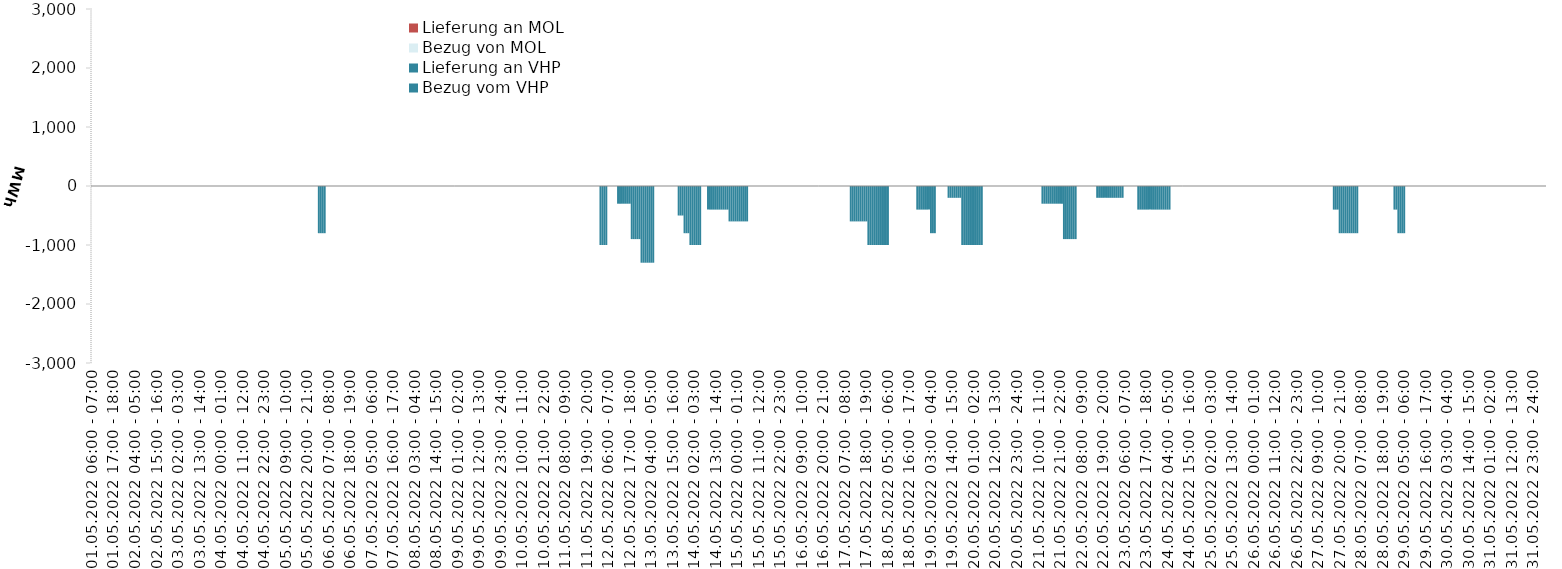
| Category | Bezug vom VHP | Lieferung an VHP | Bezug von MOL | Lieferung an MOL |
|---|---|---|---|---|
| 01.05.2022 06:00 - 07:00 | 0 | 0 | 0 | 0 |
| 01.05.2022 07:00 - 08:00 | 0 | 0 | 0 | 0 |
| 01.05.2022 08:00 - 09:00 | 0 | 0 | 0 | 0 |
| 01.05.2022 09:00 - 10:00 | 0 | 0 | 0 | 0 |
| 01.05.2022 10:00 - 11:00 | 0 | 0 | 0 | 0 |
| 01.05.2022 11:00 - 12:00 | 0 | 0 | 0 | 0 |
| 01.05.2022 12:00 - 13:00 | 0 | 0 | 0 | 0 |
| 01.05.2022 13:00 - 14:00 | 0 | 0 | 0 | 0 |
| 01.05.2022 14:00 - 15:00 | 0 | 0 | 0 | 0 |
| 01.05.2022 15:00 - 16:00 | 0 | 0 | 0 | 0 |
| 01.05.2022 16:00 - 17:00 | 0 | 0 | 0 | 0 |
| 01.05.2022 17:00 - 18:00 | 0 | 0 | 0 | 0 |
| 01.05.2022 18:00 - 19:00 | 0 | 0 | 0 | 0 |
| 01.05.2022 19:00 - 20:00 | 0 | 0 | 0 | 0 |
| 01.05.2022 20:00 - 21:00 | 0 | 0 | 0 | 0 |
| 01.05.2022 21:00 - 22:00 | 0 | 0 | 0 | 0 |
| 01.05.2022 22:00 - 23:00 | 0 | 0 | 0 | 0 |
| 01.05.2022 23:00 - 24:00 | 0 | 0 | 0 | 0 |
| 02.05.2022 00:00 - 01:00 | 0 | 0 | 0 | 0 |
| 02.05.2022 01:00 - 02:00 | 0 | 0 | 0 | 0 |
| 02.05.2022 02:00 - 03:00 | 0 | 0 | 0 | 0 |
| 02.05.2022 03:00 - 04:00 | 0 | 0 | 0 | 0 |
| 02.05.2022 04:00 - 05:00 | 0 | 0 | 0 | 0 |
| 02.05.2022 05:00 - 06:00 | 0 | 0 | 0 | 0 |
| 02.05.2022 06:00 - 07:00 | 0 | 0 | 0 | 0 |
| 02.05.2022 07:00 - 08:00 | 0 | 0 | 0 | 0 |
| 02.05.2022 08:00 - 09:00 | 0 | 0 | 0 | 0 |
| 02.05.2022 09:00 - 10:00 | 0 | 0 | 0 | 0 |
| 02.05.2022 10:00 - 11:00 | 0 | 0 | 0 | 0 |
| 02.05.2022 11:00 - 12:00 | 0 | 0 | 0 | 0 |
| 02.05.2022 12:00 - 13:00 | 0 | 0 | 0 | 0 |
| 02.05.2022 13:00 - 14:00 | 0 | 0 | 0 | 0 |
| 02.05.2022 14:00 - 15:00 | 0 | 0 | 0 | 0 |
| 02.05.2022 15:00 - 16:00 | 0 | 0 | 0 | 0 |
| 02.05.2022 16:00 - 17:00 | 0 | 0 | 0 | 0 |
| 02.05.2022 17:00 - 18:00 | 0 | 0 | 0 | 0 |
| 02.05.2022 18:00 - 19:00 | 0 | 0 | 0 | 0 |
| 02.05.2022 19:00 - 20:00 | 0 | 0 | 0 | 0 |
| 02.05.2022 20:00 - 21:00 | 0 | 0 | 0 | 0 |
| 02.05.2022 21:00 - 22:00 | 0 | 0 | 0 | 0 |
| 02.05.2022 22:00 - 23:00 | 0 | 0 | 0 | 0 |
| 02.05.2022 23:00 - 24:00 | 0 | 0 | 0 | 0 |
| 03.05.2022 00:00 - 01:00 | 0 | 0 | 0 | 0 |
| 03.05.2022 01:00 - 02:00 | 0 | 0 | 0 | 0 |
| 03.05.2022 02:00 - 03:00 | 0 | 0 | 0 | 0 |
| 03.05.2022 03:00 - 04:00 | 0 | 0 | 0 | 0 |
| 03.05.2022 04:00 - 05:00 | 0 | 0 | 0 | 0 |
| 03.05.2022 05:00 - 06:00 | 0 | 0 | 0 | 0 |
| 03.05.2022 06:00 - 07:00 | 0 | 0 | 0 | 0 |
| 03.05.2022 07:00 - 08:00 | 0 | 0 | 0 | 0 |
| 03.05.2022 08:00 - 09:00 | 0 | 0 | 0 | 0 |
| 03.05.2022 09:00 - 10:00 | 0 | 0 | 0 | 0 |
| 03.05.2022 10:00 - 11:00 | 0 | 0 | 0 | 0 |
| 03.05.2022 11:00 - 12:00 | 0 | 0 | 0 | 0 |
| 03.05.2022 12:00 - 13:00 | 0 | 0 | 0 | 0 |
| 03.05.2022 13:00 - 14:00 | 0 | 0 | 0 | 0 |
| 03.05.2022 14:00 - 15:00 | 0 | 0 | 0 | 0 |
| 03.05.2022 15:00 - 16:00 | 0 | 0 | 0 | 0 |
| 03.05.2022 16:00 - 17:00 | 0 | 0 | 0 | 0 |
| 03.05.2022 17:00 - 18:00 | 0 | 0 | 0 | 0 |
| 03.05.2022 18:00 - 19:00 | 0 | 0 | 0 | 0 |
| 03.05.2022 19:00 - 20:00 | 0 | 0 | 0 | 0 |
| 03.05.2022 20:00 - 21:00 | 0 | 0 | 0 | 0 |
| 03.05.2022 21:00 - 22:00 | 0 | 0 | 0 | 0 |
| 03.05.2022 22:00 - 23:00 | 0 | 0 | 0 | 0 |
| 03.05.2022 23:00 - 24:00 | 0 | 0 | 0 | 0 |
| 04.05.2022 00:00 - 01:00 | 0 | 0 | 0 | 0 |
| 04.05.2022 01:00 - 02:00 | 0 | 0 | 0 | 0 |
| 04.05.2022 02:00 - 03:00 | 0 | 0 | 0 | 0 |
| 04.05.2022 03:00 - 04:00 | 0 | 0 | 0 | 0 |
| 04.05.2022 04:00 - 05:00 | 0 | 0 | 0 | 0 |
| 04.05.2022 05:00 - 06:00 | 0 | 0 | 0 | 0 |
| 04.05.2022 06:00 - 07:00 | 0 | 0 | 0 | 0 |
| 04.05.2022 07:00 - 08:00 | 0 | 0 | 0 | 0 |
| 04.05.2022 08:00 - 09:00 | 0 | 0 | 0 | 0 |
| 04.05.2022 09:00 - 10:00 | 0 | 0 | 0 | 0 |
| 04.05.2022 10:00 - 11:00 | 0 | 0 | 0 | 0 |
| 04.05.2022 11:00 - 12:00 | 0 | 0 | 0 | 0 |
| 04.05.2022 12:00 - 13:00 | 0 | 0 | 0 | 0 |
| 04.05.2022 13:00 - 14:00 | 0 | 0 | 0 | 0 |
| 04.05.2022 14:00 - 15:00 | 0 | 0 | 0 | 0 |
| 04.05.2022 15:00 - 16:00 | 0 | 0 | 0 | 0 |
| 04.05.2022 16:00 - 17:00 | 0 | 0 | 0 | 0 |
| 04.05.2022 17:00 - 18:00 | 0 | 0 | 0 | 0 |
| 04.05.2022 18:00 - 19:00 | 0 | 0 | 0 | 0 |
| 04.05.2022 19:00 - 20:00 | 0 | 0 | 0 | 0 |
| 04.05.2022 20:00 - 21:00 | 0 | 0 | 0 | 0 |
| 04.05.2022 21:00 - 22:00 | 0 | 0 | 0 | 0 |
| 04.05.2022 22:00 - 23:00 | 0 | 0 | 0 | 0 |
| 04.05.2022 23:00 - 24:00 | 0 | 0 | 0 | 0 |
| 05.05.2022 00:00 - 01:00 | 0 | 0 | 0 | 0 |
| 05.05.2022 01:00 - 02:00 | 0 | 0 | 0 | 0 |
| 05.05.2022 02:00 - 03:00 | 0 | 0 | 0 | 0 |
| 05.05.2022 03:00 - 04:00 | 0 | 0 | 0 | 0 |
| 05.05.2022 04:00 - 05:00 | 0 | 0 | 0 | 0 |
| 05.05.2022 05:00 - 06:00 | 0 | 0 | 0 | 0 |
| 05.05.2022 06:00 - 07:00 | 0 | 0 | 0 | 0 |
| 05.05.2022 07:00 - 08:00 | 0 | 0 | 0 | 0 |
| 05.05.2022 08:00 - 09:00 | 0 | 0 | 0 | 0 |
| 05.05.2022 09:00 - 10:00 | 0 | 0 | 0 | 0 |
| 05.05.2022 10:00 - 11:00 | 0 | 0 | 0 | 0 |
| 05.05.2022 11:00 - 12:00 | 0 | 0 | 0 | 0 |
| 05.05.2022 12:00 - 13:00 | 0 | 0 | 0 | 0 |
| 05.05.2022 13:00 - 14:00 | 0 | 0 | 0 | 0 |
| 05.05.2022 14:00 - 15:00 | 0 | 0 | 0 | 0 |
| 05.05.2022 15:00 - 16:00 | 0 | 0 | 0 | 0 |
| 05.05.2022 16:00 - 17:00 | 0 | 0 | 0 | 0 |
| 05.05.2022 17:00 - 18:00 | 0 | 0 | 0 | 0 |
| 05.05.2022 18:00 - 19:00 | 0 | 0 | 0 | 0 |
| 05.05.2022 19:00 - 20:00 | 0 | 0 | 0 | 0 |
| 05.05.2022 20:00 - 21:00 | 0 | 0 | 0 | 0 |
| 05.05.2022 21:00 - 22:00 | 0 | 0 | 0 | 0 |
| 05.05.2022 22:00 - 23:00 | 0 | 0 | 0 | 0 |
| 05.05.2022 23:00 - 24:00 | 0 | 0 | 0 | 0 |
| 06.05.2022 00:00 - 01:00 | 0 | 0 | 0 | 0 |
| 06.05.2022 01:00 - 02:00 | 0 | 0 | 0 | 0 |
| 06.05.2022 02:00 - 03:00 | 0 | -800 | 0 | 0 |
| 06.05.2022 03:00 - 04:00 | 0 | -800 | 0 | 0 |
| 06.05.2022 04:00 - 05:00 | 0 | -800 | 0 | 0 |
| 06.05.2022 05:00 - 06:00 | 0 | -800 | 0 | 0 |
| 06.05.2022 06:00 - 07:00 | 0 | 0 | 0 | 0 |
| 06.05.2022 07:00 - 08:00 | 0 | 0 | 0 | 0 |
| 06.05.2022 08:00 - 09:00 | 0 | 0 | 0 | 0 |
| 06.05.2022 09:00 - 10:00 | 0 | 0 | 0 | 0 |
| 06.05.2022 10:00 - 11:00 | 0 | 0 | 0 | 0 |
| 06.05.2022 11:00 - 12:00 | 0 | 0 | 0 | 0 |
| 06.05.2022 12:00 - 13:00 | 0 | 0 | 0 | 0 |
| 06.05.2022 13:00 - 14:00 | 0 | 0 | 0 | 0 |
| 06.05.2022 14:00 - 15:00 | 0 | 0 | 0 | 0 |
| 06.05.2022 15:00 - 16:00 | 0 | 0 | 0 | 0 |
| 06.05.2022 16:00 - 17:00 | 0 | 0 | 0 | 0 |
| 06.05.2022 17:00 - 18:00 | 0 | 0 | 0 | 0 |
| 06.05.2022 18:00 - 19:00 | 0 | 0 | 0 | 0 |
| 06.05.2022 19:00 - 20:00 | 0 | 0 | 0 | 0 |
| 06.05.2022 20:00 - 21:00 | 0 | 0 | 0 | 0 |
| 06.05.2022 21:00 - 22:00 | 0 | 0 | 0 | 0 |
| 06.05.2022 22:00 - 23:00 | 0 | 0 | 0 | 0 |
| 06.05.2022 23:00 - 24:00 | 0 | 0 | 0 | 0 |
| 07.05.2022 00:00 - 01:00 | 0 | 0 | 0 | 0 |
| 07.05.2022 01:00 - 02:00 | 0 | 0 | 0 | 0 |
| 07.05.2022 02:00 - 03:00 | 0 | 0 | 0 | 0 |
| 07.05.2022 03:00 - 04:00 | 0 | 0 | 0 | 0 |
| 07.05.2022 04:00 - 05:00 | 0 | 0 | 0 | 0 |
| 07.05.2022 05:00 - 06:00 | 0 | 0 | 0 | 0 |
| 07.05.2022 06:00 - 07:00 | 0 | 0 | 0 | 0 |
| 07.05.2022 07:00 - 08:00 | 0 | 0 | 0 | 0 |
| 07.05.2022 08:00 - 09:00 | 0 | 0 | 0 | 0 |
| 07.05.2022 09:00 - 10:00 | 0 | 0 | 0 | 0 |
| 07.05.2022 10:00 - 11:00 | 0 | 0 | 0 | 0 |
| 07.05.2022 11:00 - 12:00 | 0 | 0 | 0 | 0 |
| 07.05.2022 12:00 - 13:00 | 0 | 0 | 0 | 0 |
| 07.05.2022 13:00 - 14:00 | 0 | 0 | 0 | 0 |
| 07.05.2022 14:00 - 15:00 | 0 | 0 | 0 | 0 |
| 07.05.2022 15:00 - 16:00 | 0 | 0 | 0 | 0 |
| 07.05.2022 16:00 - 17:00 | 0 | 0 | 0 | 0 |
| 07.05.2022 17:00 - 18:00 | 0 | 0 | 0 | 0 |
| 07.05.2022 18:00 - 19:00 | 0 | 0 | 0 | 0 |
| 07.05.2022 19:00 - 20:00 | 0 | 0 | 0 | 0 |
| 07.05.2022 20:00 - 21:00 | 0 | 0 | 0 | 0 |
| 07.05.2022 21:00 - 22:00 | 0 | 0 | 0 | 0 |
| 07.05.2022 22:00 - 23:00 | 0 | 0 | 0 | 0 |
| 07.05.2022 23:00 - 24:00 | 0 | 0 | 0 | 0 |
| 08.05.2022 00:00 - 01:00 | 0 | 0 | 0 | 0 |
| 08.05.2022 01:00 - 02:00 | 0 | 0 | 0 | 0 |
| 08.05.2022 02:00 - 03:00 | 0 | 0 | 0 | 0 |
| 08.05.2022 03:00 - 04:00 | 0 | 0 | 0 | 0 |
| 08.05.2022 04:00 - 05:00 | 0 | 0 | 0 | 0 |
| 08.05.2022 05:00 - 06:00 | 0 | 0 | 0 | 0 |
| 08.05.2022 06:00 - 07:00 | 0 | 0 | 0 | 0 |
| 08.05.2022 07:00 - 08:00 | 0 | 0 | 0 | 0 |
| 08.05.2022 08:00 - 09:00 | 0 | 0 | 0 | 0 |
| 08.05.2022 09:00 - 10:00 | 0 | 0 | 0 | 0 |
| 08.05.2022 10:00 - 11:00 | 0 | 0 | 0 | 0 |
| 08.05.2022 11:00 - 12:00 | 0 | 0 | 0 | 0 |
| 08.05.2022 12:00 - 13:00 | 0 | 0 | 0 | 0 |
| 08.05.2022 13:00 - 14:00 | 0 | 0 | 0 | 0 |
| 08.05.2022 14:00 - 15:00 | 0 | 0 | 0 | 0 |
| 08.05.2022 15:00 - 16:00 | 0 | 0 | 0 | 0 |
| 08.05.2022 16:00 - 17:00 | 0 | 0 | 0 | 0 |
| 08.05.2022 17:00 - 18:00 | 0 | 0 | 0 | 0 |
| 08.05.2022 18:00 - 19:00 | 0 | 0 | 0 | 0 |
| 08.05.2022 19:00 - 20:00 | 0 | 0 | 0 | 0 |
| 08.05.2022 20:00 - 21:00 | 0 | 0 | 0 | 0 |
| 08.05.2022 21:00 - 22:00 | 0 | 0 | 0 | 0 |
| 08.05.2022 22:00 - 23:00 | 0 | 0 | 0 | 0 |
| 08.05.2022 23:00 - 24:00 | 0 | 0 | 0 | 0 |
| 09.05.2022 00:00 - 01:00 | 0 | 0 | 0 | 0 |
| 09.05.2022 01:00 - 02:00 | 0 | 0 | 0 | 0 |
| 09.05.2022 02:00 - 03:00 | 0 | 0 | 0 | 0 |
| 09.05.2022 03:00 - 04:00 | 0 | 0 | 0 | 0 |
| 09.05.2022 04:00 - 05:00 | 0 | 0 | 0 | 0 |
| 09.05.2022 05:00 - 06:00 | 0 | 0 | 0 | 0 |
| 09.05.2022 06:00 - 07:00 | 0 | 0 | 0 | 0 |
| 09.05.2022 07:00 - 08:00 | 0 | 0 | 0 | 0 |
| 09.05.2022 08:00 - 09:00 | 0 | 0 | 0 | 0 |
| 09.05.2022 09:00 - 10:00 | 0 | 0 | 0 | 0 |
| 09.05.2022 10:00 - 11:00 | 0 | 0 | 0 | 0 |
| 09.05.2022 11:00 - 12:00 | 0 | 0 | 0 | 0 |
| 09.05.2022 12:00 - 13:00 | 0 | 0 | 0 | 0 |
| 09.05.2022 13:00 - 14:00 | 0 | 0 | 0 | 0 |
| 09.05.2022 14:00 - 15:00 | 0 | 0 | 0 | 0 |
| 09.05.2022 15:00 - 16:00 | 0 | 0 | 0 | 0 |
| 09.05.2022 16:00 - 17:00 | 0 | 0 | 0 | 0 |
| 09.05.2022 17:00 - 18:00 | 0 | 0 | 0 | 0 |
| 09.05.2022 18:00 - 19:00 | 0 | 0 | 0 | 0 |
| 09.05.2022 19:00 - 20:00 | 0 | 0 | 0 | 0 |
| 09.05.2022 20:00 - 21:00 | 0 | 0 | 0 | 0 |
| 09.05.2022 21:00 - 22:00 | 0 | 0 | 0 | 0 |
| 09.05.2022 22:00 - 23:00 | 0 | 0 | 0 | 0 |
| 09.05.2022 23:00 - 24:00 | 0 | 0 | 0 | 0 |
| 10.05.2022 00:00 - 01:00 | 0 | 0 | 0 | 0 |
| 10.05.2022 01:00 - 02:00 | 0 | 0 | 0 | 0 |
| 10.05.2022 02:00 - 03:00 | 0 | 0 | 0 | 0 |
| 10.05.2022 03:00 - 04:00 | 0 | 0 | 0 | 0 |
| 10.05.2022 04:00 - 05:00 | 0 | 0 | 0 | 0 |
| 10.05.2022 05:00 - 06:00 | 0 | 0 | 0 | 0 |
| 10.05.2022 06:00 - 07:00 | 0 | 0 | 0 | 0 |
| 10.05.2022 07:00 - 08:00 | 0 | 0 | 0 | 0 |
| 10.05.2022 08:00 - 09:00 | 0 | 0 | 0 | 0 |
| 10.05.2022 09:00 - 10:00 | 0 | 0 | 0 | 0 |
| 10.05.2022 10:00 - 11:00 | 0 | 0 | 0 | 0 |
| 10.05.2022 11:00 - 12:00 | 0 | 0 | 0 | 0 |
| 10.05.2022 12:00 - 13:00 | 0 | 0 | 0 | 0 |
| 10.05.2022 13:00 - 14:00 | 0 | 0 | 0 | 0 |
| 10.05.2022 14:00 - 15:00 | 0 | 0 | 0 | 0 |
| 10.05.2022 15:00 - 16:00 | 0 | 0 | 0 | 0 |
| 10.05.2022 16:00 - 17:00 | 0 | 0 | 0 | 0 |
| 10.05.2022 17:00 - 18:00 | 0 | 0 | 0 | 0 |
| 10.05.2022 18:00 - 19:00 | 0 | 0 | 0 | 0 |
| 10.05.2022 19:00 - 20:00 | 0 | 0 | 0 | 0 |
| 10.05.2022 20:00 - 21:00 | 0 | 0 | 0 | 0 |
| 10.05.2022 21:00 - 22:00 | 0 | 0 | 0 | 0 |
| 10.05.2022 22:00 - 23:00 | 0 | 0 | 0 | 0 |
| 10.05.2022 23:00 - 24:00 | 0 | 0 | 0 | 0 |
| 11.05.2022 00:00 - 01:00 | 0 | 0 | 0 | 0 |
| 11.05.2022 01:00 - 02:00 | 0 | 0 | 0 | 0 |
| 11.05.2022 02:00 - 03:00 | 0 | 0 | 0 | 0 |
| 11.05.2022 03:00 - 04:00 | 0 | 0 | 0 | 0 |
| 11.05.2022 04:00 - 05:00 | 0 | 0 | 0 | 0 |
| 11.05.2022 05:00 - 06:00 | 0 | 0 | 0 | 0 |
| 11.05.2022 06:00 - 07:00 | 0 | 0 | 0 | 0 |
| 11.05.2022 07:00 - 08:00 | 0 | 0 | 0 | 0 |
| 11.05.2022 08:00 - 09:00 | 0 | 0 | 0 | 0 |
| 11.05.2022 09:00 - 10:00 | 0 | 0 | 0 | 0 |
| 11.05.2022 10:00 - 11:00 | 0 | 0 | 0 | 0 |
| 11.05.2022 11:00 - 12:00 | 0 | 0 | 0 | 0 |
| 11.05.2022 12:00 - 13:00 | 0 | 0 | 0 | 0 |
| 11.05.2022 13:00 - 14:00 | 0 | 0 | 0 | 0 |
| 11.05.2022 14:00 - 15:00 | 0 | 0 | 0 | 0 |
| 11.05.2022 15:00 - 16:00 | 0 | 0 | 0 | 0 |
| 11.05.2022 16:00 - 17:00 | 0 | 0 | 0 | 0 |
| 11.05.2022 17:00 - 18:00 | 0 | 0 | 0 | 0 |
| 11.05.2022 18:00 - 19:00 | 0 | 0 | 0 | 0 |
| 11.05.2022 19:00 - 20:00 | 0 | 0 | 0 | 0 |
| 11.05.2022 20:00 - 21:00 | 0 | 0 | 0 | 0 |
| 11.05.2022 21:00 - 22:00 | 0 | 0 | 0 | 0 |
| 11.05.2022 22:00 - 23:00 | 0 | 0 | 0 | 0 |
| 11.05.2022 23:00 - 24:00 | 0 | 0 | 0 | 0 |
| 12.05.2022 00:00 - 01:00 | 0 | 0 | 0 | 0 |
| 12.05.2022 01:00 - 02:00 | 0 | 0 | 0 | 0 |
| 12.05.2022 02:00 - 03:00 | 0 | -1000 | 0 | 0 |
| 12.05.2022 03:00 - 04:00 | 0 | -1000 | 0 | 0 |
| 12.05.2022 04:00 - 05:00 | 0 | -1000 | 0 | 0 |
| 12.05.2022 05:00 - 06:00 | 0 | -1000 | 0 | 0 |
| 12.05.2022 06:00 - 07:00 | 0 | 0 | 0 | 0 |
| 12.05.2022 07:00 - 08:00 | 0 | 0 | 0 | 0 |
| 12.05.2022 08:00 - 09:00 | 0 | 0 | 0 | 0 |
| 12.05.2022 09:00 - 10:00 | 0 | 0 | 0 | 0 |
| 12.05.2022 10:00 - 11:00 | 0 | 0 | 0 | 0 |
| 12.05.2022 11:00 - 12:00 | 0 | -300 | 0 | 0 |
| 12.05.2022 12:00 - 13:00 | 0 | -300 | 0 | 0 |
| 12.05.2022 13:00 - 14:00 | 0 | -300 | 0 | 0 |
| 12.05.2022 14:00 - 15:00 | 0 | -300 | 0 | 0 |
| 12.05.2022 15:00 - 16:00 | 0 | -300 | 0 | 0 |
| 12.05.2022 16:00 - 17:00 | 0 | -300 | 0 | 0 |
| 12.05.2022 17:00 - 18:00 | 0 | -300 | 0 | 0 |
| 12.05.2022 18:00 - 19:00 | 0 | -900 | 0 | 0 |
| 12.05.2022 19:00 - 20:00 | 0 | -900 | 0 | 0 |
| 12.05.2022 20:00 - 21:00 | 0 | -900 | 0 | 0 |
| 12.05.2022 21:00 - 22:00 | 0 | -900 | 0 | 0 |
| 12.05.2022 22:00 - 23:00 | 0 | -900 | 0 | 0 |
| 12.05.2022 23:00 - 24:00 | 0 | -1300 | 0 | 0 |
| 13.05.2022 00:00 - 01:00 | 0 | -1300 | 0 | 0 |
| 13.05.2022 01:00 - 02:00 | 0 | -1300 | 0 | 0 |
| 13.05.2022 02:00 - 03:00 | 0 | -1300 | 0 | 0 |
| 13.05.2022 03:00 - 04:00 | 0 | -1300 | 0 | 0 |
| 13.05.2022 04:00 - 05:00 | 0 | -1300 | 0 | 0 |
| 13.05.2022 05:00 - 06:00 | 0 | -1300 | 0 | 0 |
| 13.05.2022 06:00 - 07:00 | 0 | 0 | 0 | 0 |
| 13.05.2022 07:00 - 08:00 | 0 | 0 | 0 | 0 |
| 13.05.2022 08:00 - 09:00 | 0 | 0 | 0 | 0 |
| 13.05.2022 09:00 - 10:00 | 0 | 0 | 0 | 0 |
| 13.05.2022 10:00 - 11:00 | 0 | 0 | 0 | 0 |
| 13.05.2022 11:00 - 12:00 | 0 | 0 | 0 | 0 |
| 13.05.2022 12:00 - 13:00 | 0 | 0 | 0 | 0 |
| 13.05.2022 13:00 - 14:00 | 0 | 0 | 0 | 0 |
| 13.05.2022 14:00 - 15:00 | 0 | 0 | 0 | 0 |
| 13.05.2022 15:00 - 16:00 | 0 | 0 | 0 | 0 |
| 13.05.2022 16:00 - 17:00 | 0 | 0 | 0 | 0 |
| 13.05.2022 17:00 - 18:00 | 0 | 0 | 0 | 0 |
| 13.05.2022 18:00 - 19:00 | 0 | -500 | 0 | 0 |
| 13.05.2022 19:00 - 20:00 | 0 | -500 | 0 | 0 |
| 13.05.2022 20:00 - 21:00 | 0 | -500 | 0 | 0 |
| 13.05.2022 21:00 - 22:00 | 0 | -800 | 0 | 0 |
| 13.05.2022 22:00 - 23:00 | 0 | -800 | 0 | 0 |
| 13.05.2022 23:00 - 24:00 | 0 | -800 | 0 | 0 |
| 14.05.2022 00:00 - 01:00 | 0 | -1000 | 0 | 0 |
| 14.05.2022 01:00 - 02:00 | 0 | -1000 | 0 | 0 |
| 14.05.2022 02:00 - 03:00 | 0 | -1000 | 0 | 0 |
| 14.05.2022 03:00 - 04:00 | 0 | -1000 | 0 | 0 |
| 14.05.2022 04:00 - 05:00 | 0 | -1000 | 0 | 0 |
| 14.05.2022 05:00 - 06:00 | 0 | -1000 | 0 | 0 |
| 14.05.2022 06:00 - 07:00 | 0 | 0 | 0 | 0 |
| 14.05.2022 07:00 - 08:00 | 0 | 0 | 0 | 0 |
| 14.05.2022 08:00 - 09:00 | 0 | 0 | 0 | 0 |
| 14.05.2022 09:00 - 10:00 | 0 | -400 | 0 | 0 |
| 14.05.2022 10:00 - 11:00 | 0 | -400 | 0 | 0 |
| 14.05.2022 11:00 - 12:00 | 0 | -400 | 0 | 0 |
| 14.05.2022 12:00 - 13:00 | 0 | -400 | 0 | 0 |
| 14.05.2022 13:00 - 14:00 | 0 | -400 | 0 | 0 |
| 14.05.2022 14:00 - 15:00 | 0 | -400 | 0 | 0 |
| 14.05.2022 15:00 - 16:00 | 0 | -400 | 0 | 0 |
| 14.05.2022 16:00 - 17:00 | 0 | -400 | 0 | 0 |
| 14.05.2022 17:00 - 18:00 | 0 | -400 | 0 | 0 |
| 14.05.2022 18:00 - 19:00 | 0 | -400 | 0 | 0 |
| 14.05.2022 19:00 - 20:00 | 0 | -400 | 0 | 0 |
| 14.05.2022 20:00 - 21:00 | 0 | -600 | 0 | 0 |
| 14.05.2022 21:00 - 22:00 | 0 | -600 | 0 | 0 |
| 14.05.2022 22:00 - 23:00 | 0 | -600 | 0 | 0 |
| 14.05.2022 23:00 - 24:00 | 0 | -600 | 0 | 0 |
| 15.05.2022 00:00 - 01:00 | 0 | -600 | 0 | 0 |
| 15.05.2022 01:00 - 02:00 | 0 | -600 | 0 | 0 |
| 15.05.2022 02:00 - 03:00 | 0 | -600 | 0 | 0 |
| 15.05.2022 03:00 - 04:00 | 0 | -600 | 0 | 0 |
| 15.05.2022 04:00 - 05:00 | 0 | -600 | 0 | 0 |
| 15.05.2022 05:00 - 06:00 | 0 | -600 | 0 | 0 |
| 15.05.2022 06:00 - 07:00 | 0 | 0 | 0 | 0 |
| 15.05.2022 07:00 - 08:00 | 0 | 0 | 0 | 0 |
| 15.05.2022 08:00 - 09:00 | 0 | 0 | 0 | 0 |
| 15.05.2022 09:00 - 10:00 | 0 | 0 | 0 | 0 |
| 15.05.2022 10:00 - 11:00 | 0 | 0 | 0 | 0 |
| 15.05.2022 11:00 - 12:00 | 0 | 0 | 0 | 0 |
| 15.05.2022 12:00 - 13:00 | 0 | 0 | 0 | 0 |
| 15.05.2022 13:00 - 14:00 | 0 | 0 | 0 | 0 |
| 15.05.2022 14:00 - 15:00 | 0 | 0 | 0 | 0 |
| 15.05.2022 15:00 - 16:00 | 0 | 0 | 0 | 0 |
| 15.05.2022 16:00 - 17:00 | 0 | 0 | 0 | 0 |
| 15.05.2022 17:00 - 18:00 | 0 | 0 | 0 | 0 |
| 15.05.2022 18:00 - 19:00 | 0 | 0 | 0 | 0 |
| 15.05.2022 19:00 - 20:00 | 0 | 0 | 0 | 0 |
| 15.05.2022 20:00 - 21:00 | 0 | 0 | 0 | 0 |
| 15.05.2022 21:00 - 22:00 | 0 | 0 | 0 | 0 |
| 15.05.2022 22:00 - 23:00 | 0 | 0 | 0 | 0 |
| 15.05.2022 23:00 - 24:00 | 0 | 0 | 0 | 0 |
| 16.05.2022 00:00 - 01:00 | 0 | 0 | 0 | 0 |
| 16.05.2022 01:00 - 02:00 | 0 | 0 | 0 | 0 |
| 16.05.2022 02:00 - 03:00 | 0 | 0 | 0 | 0 |
| 16.05.2022 03:00 - 04:00 | 0 | 0 | 0 | 0 |
| 16.05.2022 04:00 - 05:00 | 0 | 0 | 0 | 0 |
| 16.05.2022 05:00 - 06:00 | 0 | 0 | 0 | 0 |
| 16.05.2022 06:00 - 07:00 | 0 | 0 | 0 | 0 |
| 16.05.2022 07:00 - 08:00 | 0 | 0 | 0 | 0 |
| 16.05.2022 08:00 - 09:00 | 0 | 0 | 0 | 0 |
| 16.05.2022 09:00 - 10:00 | 0 | 0 | 0 | 0 |
| 16.05.2022 10:00 - 11:00 | 0 | 0 | 0 | 0 |
| 16.05.2022 11:00 - 12:00 | 0 | 0 | 0 | 0 |
| 16.05.2022 12:00 - 13:00 | 0 | 0 | 0 | 0 |
| 16.05.2022 13:00 - 14:00 | 0 | 0 | 0 | 0 |
| 16.05.2022 14:00 - 15:00 | 0 | 0 | 0 | 0 |
| 16.05.2022 15:00 - 16:00 | 0 | 0 | 0 | 0 |
| 16.05.2022 16:00 - 17:00 | 0 | 0 | 0 | 0 |
| 16.05.2022 17:00 - 18:00 | 0 | 0 | 0 | 0 |
| 16.05.2022 18:00 - 19:00 | 0 | 0 | 0 | 0 |
| 16.05.2022 19:00 - 20:00 | 0 | 0 | 0 | 0 |
| 16.05.2022 20:00 - 21:00 | 0 | 0 | 0 | 0 |
| 16.05.2022 21:00 - 22:00 | 0 | 0 | 0 | 0 |
| 16.05.2022 22:00 - 23:00 | 0 | 0 | 0 | 0 |
| 16.05.2022 23:00 - 24:00 | 0 | 0 | 0 | 0 |
| 17.05.2022 00:00 - 01:00 | 0 | 0 | 0 | 0 |
| 17.05.2022 01:00 - 02:00 | 0 | 0 | 0 | 0 |
| 17.05.2022 02:00 - 03:00 | 0 | 0 | 0 | 0 |
| 17.05.2022 03:00 - 04:00 | 0 | 0 | 0 | 0 |
| 17.05.2022 04:00 - 05:00 | 0 | 0 | 0 | 0 |
| 17.05.2022 05:00 - 06:00 | 0 | 0 | 0 | 0 |
| 17.05.2022 06:00 - 07:00 | 0 | 0 | 0 | 0 |
| 17.05.2022 07:00 - 08:00 | 0 | 0 | 0 | 0 |
| 17.05.2022 08:00 - 09:00 | 0 | 0 | 0 | 0 |
| 17.05.2022 09:00 - 10:00 | 0 | 0 | 0 | 0 |
| 17.05.2022 10:00 - 11:00 | 0 | -600 | 0 | 0 |
| 17.05.2022 11:00 - 12:00 | 0 | -600 | 0 | 0 |
| 17.05.2022 12:00 - 13:00 | 0 | -600 | 0 | 0 |
| 17.05.2022 13:00 - 14:00 | 0 | -600 | 0 | 0 |
| 17.05.2022 14:00 - 15:00 | 0 | -600 | 0 | 0 |
| 17.05.2022 15:00 - 16:00 | 0 | -600 | 0 | 0 |
| 17.05.2022 16:00 - 17:00 | 0 | -600 | 0 | 0 |
| 17.05.2022 17:00 - 18:00 | 0 | -600 | 0 | 0 |
| 17.05.2022 18:00 - 19:00 | 0 | -600 | 0 | 0 |
| 17.05.2022 19:00 - 20:00 | 0 | -1000 | 0 | 0 |
| 17.05.2022 20:00 - 21:00 | 0 | -1000 | 0 | 0 |
| 17.05.2022 21:00 - 22:00 | 0 | -1000 | 0 | 0 |
| 17.05.2022 22:00 - 23:00 | 0 | -1000 | 0 | 0 |
| 17.05.2022 23:00 - 24:00 | 0 | -1000 | 0 | 0 |
| 18.05.2022 00:00 - 01:00 | 0 | -1000 | 0 | 0 |
| 18.05.2022 01:00 - 02:00 | 0 | -1000 | 0 | 0 |
| 18.05.2022 02:00 - 03:00 | 0 | -1000 | 0 | 0 |
| 18.05.2022 03:00 - 04:00 | 0 | -1000 | 0 | 0 |
| 18.05.2022 04:00 - 05:00 | 0 | -1000 | 0 | 0 |
| 18.05.2022 05:00 - 06:00 | 0 | -1000 | 0 | 0 |
| 18.05.2022 06:00 - 07:00 | 0 | 0 | 0 | 0 |
| 18.05.2022 07:00 - 08:00 | 0 | 0 | 0 | 0 |
| 18.05.2022 08:00 - 09:00 | 0 | 0 | 0 | 0 |
| 18.05.2022 09:00 - 10:00 | 0 | 0 | 0 | 0 |
| 18.05.2022 10:00 - 11:00 | 0 | 0 | 0 | 0 |
| 18.05.2022 11:00 - 12:00 | 0 | 0 | 0 | 0 |
| 18.05.2022 12:00 - 13:00 | 0 | 0 | 0 | 0 |
| 18.05.2022 13:00 - 14:00 | 0 | 0 | 0 | 0 |
| 18.05.2022 14:00 - 15:00 | 0 | 0 | 0 | 0 |
| 18.05.2022 15:00 - 16:00 | 0 | 0 | 0 | 0 |
| 18.05.2022 16:00 - 17:00 | 0 | 0 | 0 | 0 |
| 18.05.2022 17:00 - 18:00 | 0 | 0 | 0 | 0 |
| 18.05.2022 18:00 - 19:00 | 0 | 0 | 0 | 0 |
| 18.05.2022 19:00 - 20:00 | 0 | 0 | 0 | 0 |
| 18.05.2022 20:00 - 21:00 | 0 | -400 | 0 | 0 |
| 18.05.2022 21:00 - 22:00 | 0 | -400 | 0 | 0 |
| 18.05.2022 22:00 - 23:00 | 0 | -400 | 0 | 0 |
| 18.05.2022 23:00 - 24:00 | 0 | -400 | 0 | 0 |
| 19.05.2022 00:00 - 01:00 | 0 | -400 | 0 | 0 |
| 19.05.2022 01:00 - 02:00 | 0 | -400 | 0 | 0 |
| 19.05.2022 02:00 - 03:00 | 0 | -400 | 0 | 0 |
| 19.05.2022 03:00 - 04:00 | 0 | -800 | 0 | 0 |
| 19.05.2022 04:00 - 05:00 | 0 | -800 | 0 | 0 |
| 19.05.2022 05:00 - 06:00 | 0 | -800 | 0 | 0 |
| 19.05.2022 06:00 - 07:00 | 0 | 0 | 0 | 0 |
| 19.05.2022 07:00 - 08:00 | 0 | 0 | 0 | 0 |
| 19.05.2022 08:00 - 09:00 | 0 | 0 | 0 | 0 |
| 19.05.2022 09:00 - 10:00 | 0 | 0 | 0 | 0 |
| 19.05.2022 10:00 - 11:00 | 0 | 0 | 0 | 0 |
| 19.05.2022 11:00 - 12:00 | 0 | 0 | 0 | 0 |
| 19.05.2022 12:00 - 13:00 | 0 | -200 | 0 | 0 |
| 19.05.2022 13:00 - 14:00 | 0 | -200 | 0 | 0 |
| 19.05.2022 14:00 - 15:00 | 0 | -200 | 0 | 0 |
| 19.05.2022 15:00 - 16:00 | 0 | -200 | 0 | 0 |
| 19.05.2022 16:00 - 17:00 | 0 | -200 | 0 | 0 |
| 19.05.2022 17:00 - 18:00 | 0 | -200 | 0 | 0 |
| 19.05.2022 18:00 - 19:00 | 0 | -200 | 0 | 0 |
| 19.05.2022 19:00 - 20:00 | 0 | -1000 | 0 | 0 |
| 19.05.2022 20:00 - 21:00 | 0 | -1000 | 0 | 0 |
| 19.05.2022 21:00 - 22:00 | 0 | -1000 | 0 | 0 |
| 19.05.2022 22:00 - 23:00 | 0 | -1000 | 0 | 0 |
| 19.05.2022 23:00 - 24:00 | 0 | -1000 | 0 | 0 |
| 20.05.2022 00:00 - 01:00 | 0 | -1000 | 0 | 0 |
| 20.05.2022 01:00 - 02:00 | 0 | -1000 | 0 | 0 |
| 20.05.2022 02:00 - 03:00 | 0 | -1000 | 0 | 0 |
| 20.05.2022 03:00 - 04:00 | 0 | -1000 | 0 | 0 |
| 20.05.2022 04:00 - 05:00 | 0 | -1000 | 0 | 0 |
| 20.05.2022 05:00 - 06:00 | 0 | -1000 | 0 | 0 |
| 20.05.2022 06:00 - 07:00 | 0 | 0 | 0 | 0 |
| 20.05.2022 07:00 - 08:00 | 0 | 0 | 0 | 0 |
| 20.05.2022 08:00 - 09:00 | 0 | 0 | 0 | 0 |
| 20.05.2022 09:00 - 10:00 | 0 | 0 | 0 | 0 |
| 20.05.2022 10:00 - 11:00 | 0 | 0 | 0 | 0 |
| 20.05.2022 11:00 - 12:00 | 0 | 0 | 0 | 0 |
| 20.05.2022 12:00 - 13:00 | 0 | 0 | 0 | 0 |
| 20.05.2022 13:00 - 14:00 | 0 | 0 | 0 | 0 |
| 20.05.2022 14:00 - 15:00 | 0 | 0 | 0 | 0 |
| 20.05.2022 15:00 - 16:00 | 0 | 0 | 0 | 0 |
| 20.05.2022 16:00 - 17:00 | 0 | 0 | 0 | 0 |
| 20.05.2022 17:00 - 18:00 | 0 | 0 | 0 | 0 |
| 20.05.2022 18:00 - 19:00 | 0 | 0 | 0 | 0 |
| 20.05.2022 19:00 - 20:00 | 0 | 0 | 0 | 0 |
| 20.05.2022 20:00 - 21:00 | 0 | 0 | 0 | 0 |
| 20.05.2022 21:00 - 22:00 | 0 | 0 | 0 | 0 |
| 20.05.2022 22:00 - 23:00 | 0 | 0 | 0 | 0 |
| 20.05.2022 23:00 - 24:00 | 0 | 0 | 0 | 0 |
| 21.05.2022 00:00 - 01:00 | 0 | 0 | 0 | 0 |
| 21.05.2022 01:00 - 02:00 | 0 | 0 | 0 | 0 |
| 21.05.2022 02:00 - 03:00 | 0 | 0 | 0 | 0 |
| 21.05.2022 03:00 - 04:00 | 0 | 0 | 0 | 0 |
| 21.05.2022 04:00 - 05:00 | 0 | 0 | 0 | 0 |
| 21.05.2022 05:00 - 06:00 | 0 | 0 | 0 | 0 |
| 21.05.2022 06:00 - 07:00 | 0 | 0 | 0 | 0 |
| 21.05.2022 07:00 - 08:00 | 0 | 0 | 0 | 0 |
| 21.05.2022 08:00 - 09:00 | 0 | 0 | 0 | 0 |
| 21.05.2022 09:00 - 10:00 | 0 | 0 | 0 | 0 |
| 21.05.2022 10:00 - 11:00 | 0 | 0 | 0 | 0 |
| 21.05.2022 11:00 - 12:00 | 0 | 0 | 0 | 0 |
| 21.05.2022 12:00 - 13:00 | 0 | -300 | 0 | 0 |
| 21.05.2022 13:00 - 14:00 | 0 | -300 | 0 | 0 |
| 21.05.2022 14:00 - 15:00 | 0 | -300 | 0 | 0 |
| 21.05.2022 15:00 - 16:00 | 0 | -300 | 0 | 0 |
| 21.05.2022 16:00 - 17:00 | 0 | -300 | 0 | 0 |
| 21.05.2022 17:00 - 18:00 | 0 | -300 | 0 | 0 |
| 21.05.2022 18:00 - 19:00 | 0 | -300 | 0 | 0 |
| 21.05.2022 19:00 - 20:00 | 0 | -300 | 0 | 0 |
| 21.05.2022 20:00 - 21:00 | 0 | -300 | 0 | 0 |
| 21.05.2022 21:00 - 22:00 | 0 | -300 | 0 | 0 |
| 21.05.2022 22:00 - 23:00 | 0 | -300 | 0 | 0 |
| 21.05.2022 23:00 - 24:00 | 0 | -900 | 0 | 0 |
| 22.05.2022 00:00 - 01:00 | 0 | -900 | 0 | 0 |
| 22.05.2022 01:00 - 02:00 | 0 | -900 | 0 | 0 |
| 22.05.2022 02:00 - 03:00 | 0 | -900 | 0 | 0 |
| 22.05.2022 03:00 - 04:00 | 0 | -900 | 0 | 0 |
| 22.05.2022 04:00 - 05:00 | 0 | -900 | 0 | 0 |
| 22.05.2022 05:00 - 06:00 | 0 | -900 | 0 | 0 |
| 22.05.2022 06:00 - 07:00 | 0 | 0 | 0 | 0 |
| 22.05.2022 07:00 - 08:00 | 0 | 0 | 0 | 0 |
| 22.05.2022 08:00 - 09:00 | 0 | 0 | 0 | 0 |
| 22.05.2022 09:00 - 10:00 | 0 | 0 | 0 | 0 |
| 22.05.2022 10:00 - 11:00 | 0 | 0 | 0 | 0 |
| 22.05.2022 11:00 - 12:00 | 0 | 0 | 0 | 0 |
| 22.05.2022 12:00 - 13:00 | 0 | 0 | 0 | 0 |
| 22.05.2022 13:00 - 14:00 | 0 | 0 | 0 | 0 |
| 22.05.2022 14:00 - 15:00 | 0 | 0 | 0 | 0 |
| 22.05.2022 15:00 - 16:00 | 0 | 0 | 0 | 0 |
| 22.05.2022 16:00 - 17:00 | 0 | -200 | 0 | 0 |
| 22.05.2022 17:00 - 18:00 | 0 | -200 | 0 | 0 |
| 22.05.2022 18:00 - 19:00 | 0 | -200 | 0 | 0 |
| 22.05.2022 19:00 - 20:00 | 0 | -200 | 0 | 0 |
| 22.05.2022 20:00 - 21:00 | 0 | -200 | 0 | 0 |
| 22.05.2022 21:00 - 22:00 | 0 | -200 | 0 | 0 |
| 22.05.2022 22:00 - 23:00 | 0 | -200 | 0 | 0 |
| 22.05.2022 23:00 - 24:00 | 0 | -200 | 0 | 0 |
| 23.05.2022 00:00 - 01:00 | 0 | -200 | 0 | 0 |
| 23.05.2022 01:00 - 02:00 | 0 | -200 | 0 | 0 |
| 23.05.2022 02:00 - 03:00 | 0 | -200 | 0 | 0 |
| 23.05.2022 03:00 - 04:00 | 0 | -200 | 0 | 0 |
| 23.05.2022 04:00 - 05:00 | 0 | -200 | 0 | 0 |
| 23.05.2022 05:00 - 06:00 | 0 | -200 | 0 | 0 |
| 23.05.2022 06:00 - 07:00 | 0 | 0 | 0 | 0 |
| 23.05.2022 07:00 - 08:00 | 0 | 0 | 0 | 0 |
| 23.05.2022 08:00 - 09:00 | 0 | 0 | 0 | 0 |
| 23.05.2022 09:00 - 10:00 | 0 | 0 | 0 | 0 |
| 23.05.2022 10:00 - 11:00 | 0 | 0 | 0 | 0 |
| 23.05.2022 11:00 - 12:00 | 0 | 0 | 0 | 0 |
| 23.05.2022 12:00 - 13:00 | 0 | 0 | 0 | 0 |
| 23.05.2022 13:00 - 14:00 | 0 | -400 | 0 | 0 |
| 23.05.2022 14:00 - 15:00 | 0 | -400 | 0 | 0 |
| 23.05.2022 15:00 - 16:00 | 0 | -400 | 0 | 0 |
| 23.05.2022 16:00 - 17:00 | 0 | -400 | 0 | 0 |
| 23.05.2022 17:00 - 18:00 | 0 | -400 | 0 | 0 |
| 23.05.2022 18:00 - 19:00 | 0 | -400 | 0 | 0 |
| 23.05.2022 19:00 - 20:00 | 0 | -400 | 0 | 0 |
| 23.05.2022 20:00 - 21:00 | 0 | -400 | 0 | 0 |
| 23.05.2022 21:00 - 22:00 | 0 | -400 | 0 | 0 |
| 23.05.2022 22:00 - 23:00 | 0 | -400 | 0 | 0 |
| 23.05.2022 23:00 - 24:00 | 0 | -400 | 0 | 0 |
| 24.05.2022 00:00 - 01:00 | 0 | -400 | 0 | 0 |
| 24.05.2022 01:00 - 02:00 | 0 | -400 | 0 | 0 |
| 24.05.2022 02:00 - 03:00 | 0 | -400 | 0 | 0 |
| 24.05.2022 03:00 - 04:00 | 0 | -400 | 0 | 0 |
| 24.05.2022 04:00 - 05:00 | 0 | -400 | 0 | 0 |
| 24.05.2022 05:00 - 06:00 | 0 | -400 | 0 | 0 |
| 24.05.2022 06:00 - 07:00 | 0 | 0 | 0 | 0 |
| 24.05.2022 07:00 - 08:00 | 0 | 0 | 0 | 0 |
| 24.05.2022 08:00 - 09:00 | 0 | 0 | 0 | 0 |
| 24.05.2022 09:00 - 10:00 | 0 | 0 | 0 | 0 |
| 24.05.2022 10:00 - 11:00 | 0 | 0 | 0 | 0 |
| 24.05.2022 11:00 - 12:00 | 0 | 0 | 0 | 0 |
| 24.05.2022 12:00 - 13:00 | 0 | 0 | 0 | 0 |
| 24.05.2022 13:00 - 14:00 | 0 | 0 | 0 | 0 |
| 24.05.2022 14:00 - 15:00 | 0 | 0 | 0 | 0 |
| 24.05.2022 15:00 - 16:00 | 0 | 0 | 0 | 0 |
| 24.05.2022 16:00 - 17:00 | 0 | 0 | 0 | 0 |
| 24.05.2022 17:00 - 18:00 | 0 | 0 | 0 | 0 |
| 24.05.2022 18:00 - 19:00 | 0 | 0 | 0 | 0 |
| 24.05.2022 19:00 - 20:00 | 0 | 0 | 0 | 0 |
| 24.05.2022 20:00 - 21:00 | 0 | 0 | 0 | 0 |
| 24.05.2022 21:00 - 22:00 | 0 | 0 | 0 | 0 |
| 24.05.2022 22:00 - 23:00 | 0 | 0 | 0 | 0 |
| 24.05.2022 23:00 - 24:00 | 0 | 0 | 0 | 0 |
| 25.05.2022 00:00 - 01:00 | 0 | 0 | 0 | 0 |
| 25.05.2022 01:00 - 02:00 | 0 | 0 | 0 | 0 |
| 25.05.2022 02:00 - 03:00 | 0 | 0 | 0 | 0 |
| 25.05.2022 03:00 - 04:00 | 0 | 0 | 0 | 0 |
| 25.05.2022 04:00 - 05:00 | 0 | 0 | 0 | 0 |
| 25.05.2022 05:00 - 06:00 | 0 | 0 | 0 | 0 |
| 25.05.2022 06:00 - 07:00 | 0 | 0 | 0 | 0 |
| 25.05.2022 07:00 - 08:00 | 0 | 0 | 0 | 0 |
| 25.05.2022 08:00 - 09:00 | 0 | 0 | 0 | 0 |
| 25.05.2022 09:00 - 10:00 | 0 | 0 | 0 | 0 |
| 25.05.2022 10:00 - 11:00 | 0 | 0 | 0 | 0 |
| 25.05.2022 11:00 - 12:00 | 0 | 0 | 0 | 0 |
| 25.05.2022 12:00 - 13:00 | 0 | 0 | 0 | 0 |
| 25.05.2022 13:00 - 14:00 | 0 | 0 | 0 | 0 |
| 25.05.2022 14:00 - 15:00 | 0 | 0 | 0 | 0 |
| 25.05.2022 15:00 - 16:00 | 0 | 0 | 0 | 0 |
| 25.05.2022 16:00 - 17:00 | 0 | 0 | 0 | 0 |
| 25.05.2022 17:00 - 18:00 | 0 | 0 | 0 | 0 |
| 25.05.2022 18:00 - 19:00 | 0 | 0 | 0 | 0 |
| 25.05.2022 19:00 - 20:00 | 0 | 0 | 0 | 0 |
| 25.05.2022 20:00 - 21:00 | 0 | 0 | 0 | 0 |
| 25.05.2022 21:00 - 22:00 | 0 | 0 | 0 | 0 |
| 25.05.2022 22:00 - 23:00 | 0 | 0 | 0 | 0 |
| 25.05.2022 23:00 - 24:00 | 0 | 0 | 0 | 0 |
| 26.05.2022 00:00 - 01:00 | 0 | 0 | 0 | 0 |
| 26.05.2022 01:00 - 02:00 | 0 | 0 | 0 | 0 |
| 26.05.2022 02:00 - 03:00 | 0 | 0 | 0 | 0 |
| 26.05.2022 03:00 - 04:00 | 0 | 0 | 0 | 0 |
| 26.05.2022 04:00 - 05:00 | 0 | 0 | 0 | 0 |
| 26.05.2022 05:00 - 06:00 | 0 | 0 | 0 | 0 |
| 26.05.2022 06:00 - 07:00 | 0 | 0 | 0 | 0 |
| 26.05.2022 07:00 - 08:00 | 0 | 0 | 0 | 0 |
| 26.05.2022 08:00 - 09:00 | 0 | 0 | 0 | 0 |
| 26.05.2022 09:00 - 10:00 | 0 | 0 | 0 | 0 |
| 26.05.2022 10:00 - 11:00 | 0 | 0 | 0 | 0 |
| 26.05.2022 11:00 - 12:00 | 0 | 0 | 0 | 0 |
| 26.05.2022 12:00 - 13:00 | 0 | 0 | 0 | 0 |
| 26.05.2022 13:00 - 14:00 | 0 | 0 | 0 | 0 |
| 26.05.2022 14:00 - 15:00 | 0 | 0 | 0 | 0 |
| 26.05.2022 15:00 - 16:00 | 0 | 0 | 0 | 0 |
| 26.05.2022 16:00 - 17:00 | 0 | 0 | 0 | 0 |
| 26.05.2022 17:00 - 18:00 | 0 | 0 | 0 | 0 |
| 26.05.2022 18:00 - 19:00 | 0 | 0 | 0 | 0 |
| 26.05.2022 19:00 - 20:00 | 0 | 0 | 0 | 0 |
| 26.05.2022 20:00 - 21:00 | 0 | 0 | 0 | 0 |
| 26.05.2022 21:00 - 22:00 | 0 | 0 | 0 | 0 |
| 26.05.2022 22:00 - 23:00 | 0 | 0 | 0 | 0 |
| 26.05.2022 23:00 - 24:00 | 0 | 0 | 0 | 0 |
| 27.05.2022 00:00 - 01:00 | 0 | 0 | 0 | 0 |
| 27.05.2022 01:00 - 02:00 | 0 | 0 | 0 | 0 |
| 27.05.2022 02:00 - 03:00 | 0 | 0 | 0 | 0 |
| 27.05.2022 03:00 - 04:00 | 0 | 0 | 0 | 0 |
| 27.05.2022 04:00 - 05:00 | 0 | 0 | 0 | 0 |
| 27.05.2022 05:00 - 06:00 | 0 | 0 | 0 | 0 |
| 27.05.2022 06:00 - 07:00 | 0 | 0 | 0 | 0 |
| 27.05.2022 07:00 - 08:00 | 0 | 0 | 0 | 0 |
| 27.05.2022 08:00 - 09:00 | 0 | 0 | 0 | 0 |
| 27.05.2022 09:00 - 10:00 | 0 | 0 | 0 | 0 |
| 27.05.2022 10:00 - 11:00 | 0 | 0 | 0 | 0 |
| 27.05.2022 11:00 - 12:00 | 0 | 0 | 0 | 0 |
| 27.05.2022 12:00 - 13:00 | 0 | 0 | 0 | 0 |
| 27.05.2022 13:00 - 14:00 | 0 | 0 | 0 | 0 |
| 27.05.2022 14:00 - 15:00 | 0 | 0 | 0 | 0 |
| 27.05.2022 15:00 - 16:00 | 0 | 0 | 0 | 0 |
| 27.05.2022 16:00 - 17:00 | 0 | 0 | 0 | 0 |
| 27.05.2022 17:00 - 18:00 | 0 | -400 | 0 | 0 |
| 27.05.2022 18:00 - 19:00 | 0 | -400 | 0 | 0 |
| 27.05.2022 19:00 - 20:00 | 0 | -400 | 0 | 0 |
| 27.05.2022 20:00 - 21:00 | 0 | -800 | 0 | 0 |
| 27.05.2022 21:00 - 22:00 | 0 | -800 | 0 | 0 |
| 27.05.2022 22:00 - 23:00 | 0 | -800 | 0 | 0 |
| 27.05.2022 23:00 - 24:00 | 0 | -800 | 0 | 0 |
| 28.05.2022 00:00 - 01:00 | 0 | -800 | 0 | 0 |
| 28.05.2022 01:00 - 02:00 | 0 | -800 | 0 | 0 |
| 28.05.2022 02:00 - 03:00 | 0 | -800 | 0 | 0 |
| 28.05.2022 03:00 - 04:00 | 0 | -800 | 0 | 0 |
| 28.05.2022 04:00 - 05:00 | 0 | -800 | 0 | 0 |
| 28.05.2022 05:00 - 06:00 | 0 | -800 | 0 | 0 |
| 28.05.2022 06:00 - 07:00 | 0 | 0 | 0 | 0 |
| 28.05.2022 07:00 - 08:00 | 0 | 0 | 0 | 0 |
| 28.05.2022 08:00 - 09:00 | 0 | 0 | 0 | 0 |
| 28.05.2022 09:00 - 10:00 | 0 | 0 | 0 | 0 |
| 28.05.2022 10:00 - 11:00 | 0 | 0 | 0 | 0 |
| 28.05.2022 11:00 - 12:00 | 0 | 0 | 0 | 0 |
| 28.05.2022 12:00 - 13:00 | 0 | 0 | 0 | 0 |
| 28.05.2022 13:00 - 14:00 | 0 | 0 | 0 | 0 |
| 28.05.2022 14:00 - 15:00 | 0 | 0 | 0 | 0 |
| 28.05.2022 15:00 - 16:00 | 0 | 0 | 0 | 0 |
| 28.05.2022 16:00 - 17:00 | 0 | 0 | 0 | 0 |
| 28.05.2022 17:00 - 18:00 | 0 | 0 | 0 | 0 |
| 28.05.2022 18:00 - 19:00 | 0 | 0 | 0 | 0 |
| 28.05.2022 19:00 - 20:00 | 0 | 0 | 0 | 0 |
| 28.05.2022 20:00 - 21:00 | 0 | 0 | 0 | 0 |
| 28.05.2022 21:00 - 22:00 | 0 | 0 | 0 | 0 |
| 28.05.2022 22:00 - 23:00 | 0 | 0 | 0 | 0 |
| 28.05.2022 23:00 - 24:00 | 0 | 0 | 0 | 0 |
| 29.05.2022 00:00 - 01:00 | 0 | -400 | 0 | 0 |
| 29.05.2022 01:00 - 02:00 | 0 | -400 | 0 | 0 |
| 29.05.2022 02:00 - 03:00 | 0 | -800 | 0 | 0 |
| 29.05.2022 03:00 - 04:00 | 0 | -800 | 0 | 0 |
| 29.05.2022 04:00 - 05:00 | 0 | -800 | 0 | 0 |
| 29.05.2022 05:00 - 06:00 | 0 | -800 | 0 | 0 |
| 29.05.2022 06:00 - 07:00 | 0 | 0 | 0 | 0 |
| 29.05.2022 07:00 - 08:00 | 0 | 0 | 0 | 0 |
| 29.05.2022 08:00 - 09:00 | 0 | 0 | 0 | 0 |
| 29.05.2022 09:00 - 10:00 | 0 | 0 | 0 | 0 |
| 29.05.2022 10:00 - 11:00 | 0 | 0 | 0 | 0 |
| 29.05.2022 11:00 - 12:00 | 0 | 0 | 0 | 0 |
| 29.05.2022 12:00 - 13:00 | 0 | 0 | 0 | 0 |
| 29.05.2022 13:00 - 14:00 | 0 | 0 | 0 | 0 |
| 29.05.2022 14:00 - 15:00 | 0 | 0 | 0 | 0 |
| 29.05.2022 15:00 - 16:00 | 0 | 0 | 0 | 0 |
| 29.05.2022 16:00 - 17:00 | 0 | 0 | 0 | 0 |
| 29.05.2022 17:00 - 18:00 | 0 | 0 | 0 | 0 |
| 29.05.2022 18:00 - 19:00 | 0 | 0 | 0 | 0 |
| 29.05.2022 19:00 - 20:00 | 0 | 0 | 0 | 0 |
| 29.05.2022 20:00 - 21:00 | 0 | 0 | 0 | 0 |
| 29.05.2022 21:00 - 22:00 | 0 | 0 | 0 | 0 |
| 29.05.2022 22:00 - 23:00 | 0 | 0 | 0 | 0 |
| 29.05.2022 23:00 - 24:00 | 0 | 0 | 0 | 0 |
| 30.05.2022 00:00 - 01:00 | 0 | 0 | 0 | 0 |
| 30.05.2022 01:00 - 02:00 | 0 | 0 | 0 | 0 |
| 30.05.2022 02:00 - 03:00 | 0 | 0 | 0 | 0 |
| 30.05.2022 03:00 - 04:00 | 0 | 0 | 0 | 0 |
| 30.05.2022 04:00 - 05:00 | 0 | 0 | 0 | 0 |
| 30.05.2022 05:00 - 06:00 | 0 | 0 | 0 | 0 |
| 30.05.2022 06:00 - 07:00 | 0 | 0 | 0 | 0 |
| 30.05.2022 07:00 - 08:00 | 0 | 0 | 0 | 0 |
| 30.05.2022 08:00 - 09:00 | 0 | 0 | 0 | 0 |
| 30.05.2022 09:00 - 10:00 | 0 | 0 | 0 | 0 |
| 30.05.2022 10:00 - 11:00 | 0 | 0 | 0 | 0 |
| 30.05.2022 11:00 - 12:00 | 0 | 0 | 0 | 0 |
| 30.05.2022 12:00 - 13:00 | 0 | 0 | 0 | 0 |
| 30.05.2022 13:00 - 14:00 | 0 | 0 | 0 | 0 |
| 30.05.2022 14:00 - 15:00 | 0 | 0 | 0 | 0 |
| 30.05.2022 15:00 - 16:00 | 0 | 0 | 0 | 0 |
| 30.05.2022 16:00 - 17:00 | 0 | 0 | 0 | 0 |
| 30.05.2022 17:00 - 18:00 | 0 | 0 | 0 | 0 |
| 30.05.2022 18:00 - 19:00 | 0 | 0 | 0 | 0 |
| 30.05.2022 19:00 - 20:00 | 0 | 0 | 0 | 0 |
| 30.05.2022 20:00 - 21:00 | 0 | 0 | 0 | 0 |
| 30.05.2022 21:00 - 22:00 | 0 | 0 | 0 | 0 |
| 30.05.2022 22:00 - 23:00 | 0 | 0 | 0 | 0 |
| 30.05.2022 23:00 - 24:00 | 0 | 0 | 0 | 0 |
| 31.05.2022 00:00 - 01:00 | 0 | 0 | 0 | 0 |
| 31.05.2022 01:00 - 02:00 | 0 | 0 | 0 | 0 |
| 31.05.2022 02:00 - 03:00 | 0 | 0 | 0 | 0 |
| 31.05.2022 03:00 - 04:00 | 0 | 0 | 0 | 0 |
| 31.05.2022 04:00 - 05:00 | 0 | 0 | 0 | 0 |
| 31.05.2022 05:00 - 06:00 | 0 | 0 | 0 | 0 |
| 31.05.2022 06:00 - 07:00 | 0 | 0 | 0 | 0 |
| 31.05.2022 07:00 - 08:00 | 0 | 0 | 0 | 0 |
| 31.05.2022 08:00 - 09:00 | 0 | 0 | 0 | 0 |
| 31.05.2022 09:00 - 10:00 | 0 | 0 | 0 | 0 |
| 31.05.2022 10:00 - 11:00 | 0 | 0 | 0 | 0 |
| 31.05.2022 11:00 - 12:00 | 0 | 0 | 0 | 0 |
| 31.05.2022 12:00 - 13:00 | 0 | 0 | 0 | 0 |
| 31.05.2022 13:00 - 14:00 | 0 | 0 | 0 | 0 |
| 31.05.2022 14:00 - 15:00 | 0 | 0 | 0 | 0 |
| 31.05.2022 15:00 - 16:00 | 0 | 0 | 0 | 0 |
| 31.05.2022 16:00 - 17:00 | 0 | 0 | 0 | 0 |
| 31.05.2022 17:00 - 18:00 | 0 | 0 | 0 | 0 |
| 31.05.2022 18:00 - 19:00 | 0 | 0 | 0 | 0 |
| 31.05.2022 19:00 - 20:00 | 0 | 0 | 0 | 0 |
| 31.05.2022 20:00 - 21:00 | 0 | 0 | 0 | 0 |
| 31.05.2022 21:00 - 22:00 | 0 | 0 | 0 | 0 |
| 31.05.2022 22:00 - 23:00 | 0 | 0 | 0 | 0 |
| 31.05.2022 23:00 - 24:00 | 0 | 0 | 0 | 0 |
| 01.06.2022 00:00 - 01:00 | 0 | 0 | 0 | 0 |
| 01.06.2022 01:00 - 02:00 | 0 | 0 | 0 | 0 |
| 01.06.2022 02:00 - 03:00 | 0 | 0 | 0 | 0 |
| 01.06.2022 03:00 - 04:00 | 0 | 0 | 0 | 0 |
| 01.06.2022 04:00 - 05:00 | 0 | 0 | 0 | 0 |
| 01.06.2022 05:00 - 06:00 | 0 | 0 | 0 | 0 |